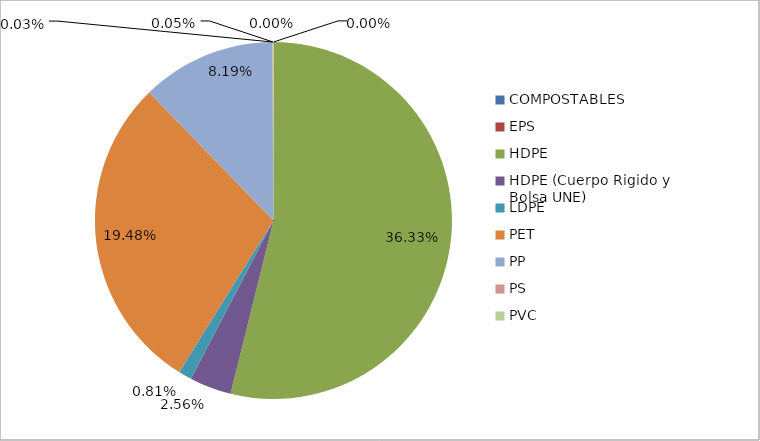
| Category | Series 0 |
|---|---|
| COMPOSTABLES | 0 |
| EPS | 0 |
| HDPE | 0.363 |
| HDPE (Cuerpo Rigido y Bolsa UNE) | 0.026 |
| LDPE | 0.008 |
| PET | 0.195 |
| PP | 0.082 |
| PS | 0 |
| PVC | 0 |